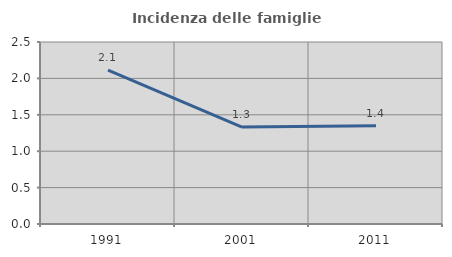
| Category | Incidenza delle famiglie numerose |
|---|---|
| 1991.0 | 2.114 |
| 2001.0 | 1.332 |
| 2011.0 | 1.35 |